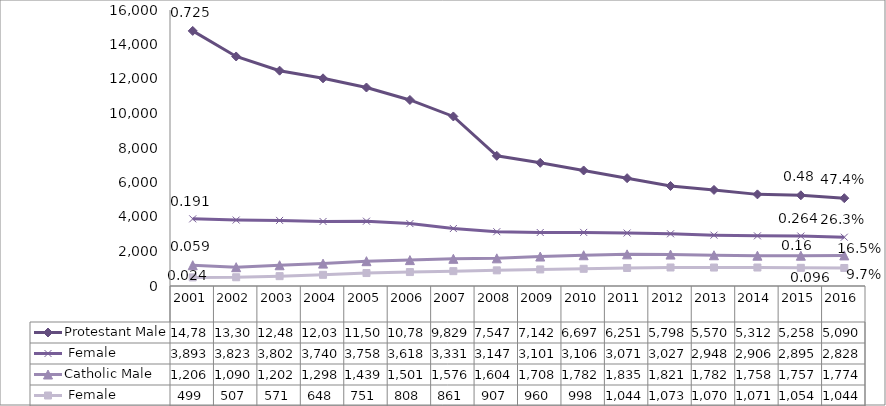
| Category | Protestant | Catholic |
|---|---|---|
| 2001.0 | 3893 | 499 |
| 2002.0 | 3823 | 507 |
| 2003.0 | 3802 | 571 |
| 2004.0 | 3740 | 648 |
| 2005.0 | 3758 | 751 |
| 2006.0 | 3618 | 808 |
| 2007.0 | 3331 | 861 |
| 2008.0 | 3147 | 907 |
| 2009.0 | 3101 | 960 |
| 2010.0 | 3106 | 998 |
| 2011.0 | 3071 | 1044 |
| 2012.0 | 3027 | 1073 |
| 2013.0 | 2948 | 1070 |
| 2014.0 | 2906 | 1071 |
| 2015.0 | 2895 | 1054 |
| 2016.0 | 2828 | 1044 |